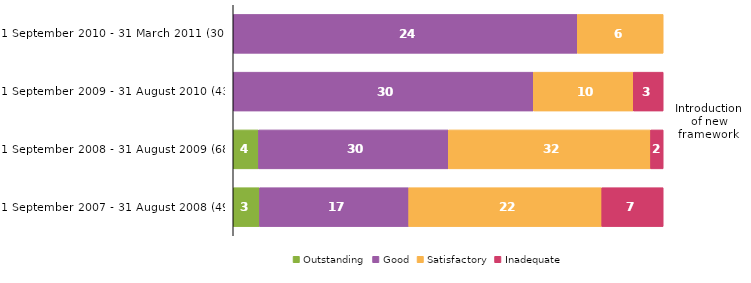
| Category | Outstanding | Good | Satisfactory | Inadequate |
|---|---|---|---|---|
| 1 September 2010 - 31 March 2011 (30)² | 0 | 24 | 6 | 0 |
| 1 September 2009 - 31 August 2010 (43) | 0 | 30 | 10 | 3 |
| 1 September 2008 - 31 August 2009 (68) | 4 | 30 | 32 | 2 |
| 1 September 2007 - 31 August 2008 (49) | 3 | 17 | 22 | 7 |